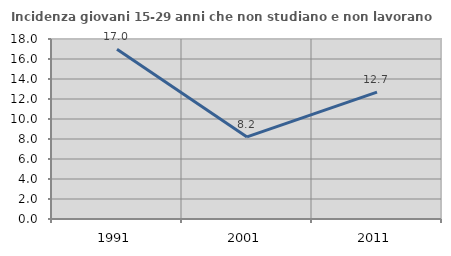
| Category | Incidenza giovani 15-29 anni che non studiano e non lavorano  |
|---|---|
| 1991.0 | 16.966 |
| 2001.0 | 8.212 |
| 2011.0 | 12.683 |